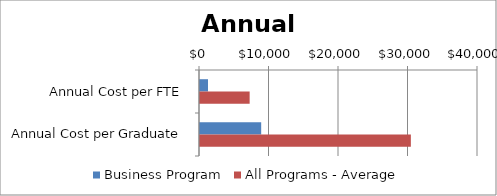
| Category | Business Program | All Programs - Average |
|---|---|---|
| Annual Cost per FTE | 1151.532 | 7144 |
| Annual Cost per Graduate | 8803.987 | 30340 |